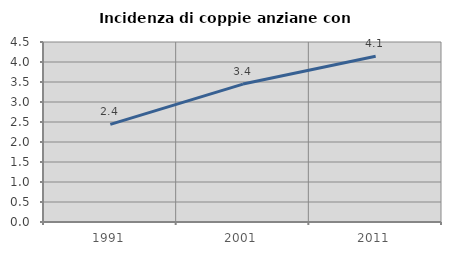
| Category | Incidenza di coppie anziane con figli |
|---|---|
| 1991.0 | 2.442 |
| 2001.0 | 3.448 |
| 2011.0 | 4.143 |